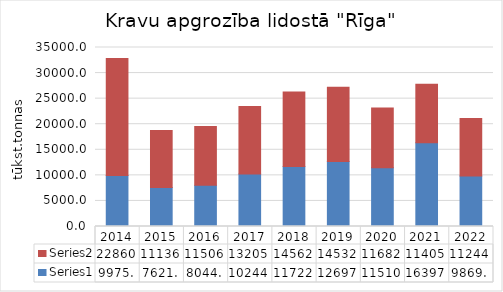
| Category | Series 0 | Series 1 |
|---|---|---|
| 2014.0 | 9975 | 22860 |
| 2015.0 | 7621 | 11136 |
| 2016.0 | 8044 | 11506 |
| 2017.0 | 10244 | 13205 |
| 2018.0 | 11722 | 14562 |
| 2019.0 | 12697 | 14532 |
| 2020.0 | 11510 | 11682 |
| 2021.0 | 16397 | 11405 |
| 2022.0 | 9869 | 11244 |